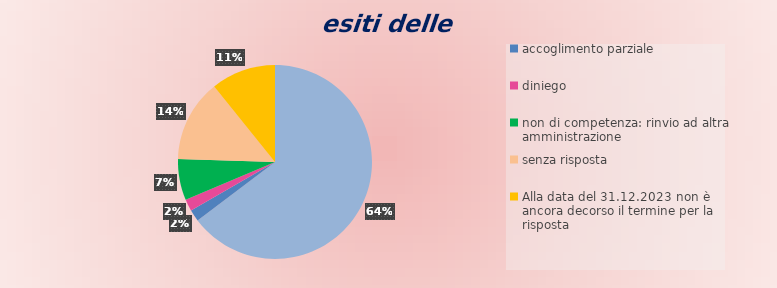
| Category | Series 0 |
|---|---|
| accoglimento | 66 |
| accoglimento parziale | 2 |
| diniego | 2 |
| non di competenza: rinvio ad altra amministrazione | 7 |
| senza risposta | 14 |
| Alla data del 31.12.2023 non è ancora decorso il termine per la risposta | 11 |